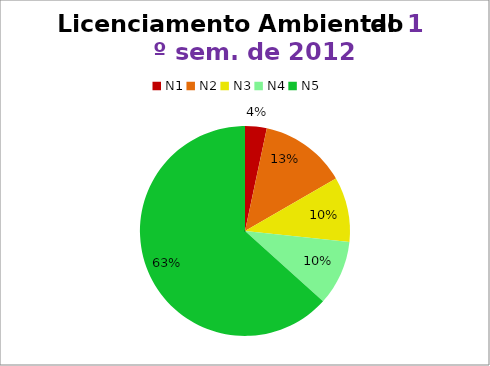
| Category | 1º/12 |
|---|---|
| N1 | 1 |
| N2 | 4 |
| N3 | 3 |
| N4 | 3 |
| N5 | 19 |